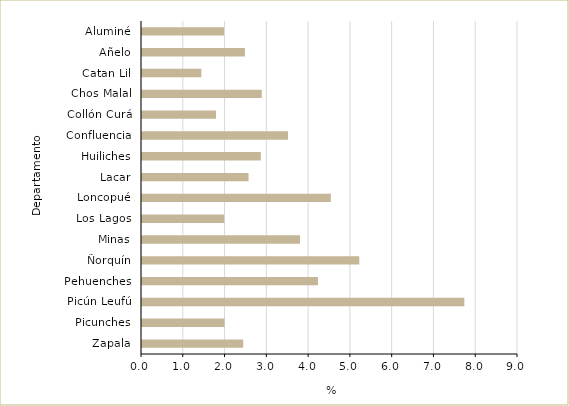
| Category | Series 0 |
|---|---|
| Aluminé | 1.964 |
| Añelo | 2.464 |
| Catan Lil | 1.42 |
| Chos Malal | 2.867 |
| Collón Curá | 1.772 |
| Confluencia | 3.495 |
| Huiliches | 2.845 |
| Lacar | 2.551 |
| Loncopué | 4.52 |
| Los Lagos | 1.969 |
| Minas | 3.783 |
| Ñorquín | 5.201 |
| Pehuenches | 4.212 |
| Picún Leufú | 7.716 |
| Picunches | 1.975 |
| Zapala | 2.423 |